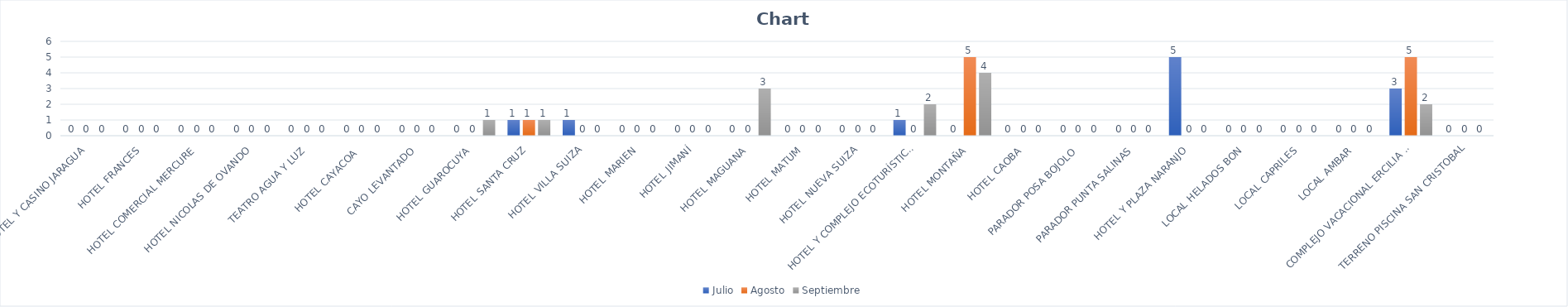
| Category | Julio | Agosto | Septiembre |
|---|---|---|---|
| HOTEL Y CASINO JARAGUA | 0 | 0 | 0 |
| HOTEL FRANCES | 0 | 0 | 0 |
| HOTEL COMERCIAL MERCURE | 0 | 0 | 0 |
| HOTEL NICOLAS DE OVANDO | 0 | 0 | 0 |
| TEATRO AGUA Y LUZ | 0 | 0 | 0 |
| HOTEL CAYACOA  | 0 | 0 | 0 |
| CAYO LEVANTADO | 0 | 0 | 0 |
| HOTEL GUAROCUYA | 0 | 0 | 1 |
| HOTEL SANTA CRUZ | 1 | 1 | 1 |
| HOTEL VILLA SUIZA | 1 | 0 | 0 |
| HOTEL MARIEN | 0 | 0 | 0 |
| HOTEL JIMANÍ | 0 | 0 | 0 |
| HOTEL MAGUANA | 0 | 0 | 3 |
| HOTEL MATUM | 0 | 0 | 0 |
| HOTEL NUEVA SUIZA | 0 | 0 | 0 |
| HOTEL Y COMPLEJO ECOTURÍSTICO LA MANSIÓN | 1 | 0 | 2 |
| HOTEL MONTAÑA | 0 | 5 | 4 |
| HOTEL CAOBA | 0 | 0 | 0 |
| PARADOR POSA BOJOLO | 0 | 0 | 0 |
| PARADOR PUNTA SALINAS | 0 | 0 | 0 |
| HOTEL Y PLAZA NARANJO | 5 | 0 | 0 |
| LOCAL HELADOS BON | 0 | 0 | 0 |
| LOCAL CAPRILES | 0 | 0 | 0 |
| LOCAL AMBAR | 0 | 0 | 0 |
| COMPLEJO VACACIONAL ERCILIA PEPÍN | 3 | 5 | 2 |
| TERRENO PISCINA SAN CRISTOBAL | 0 | 0 | 0 |